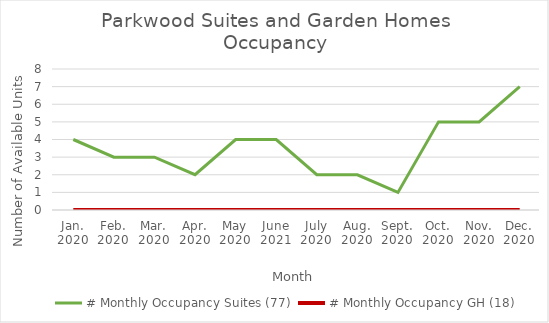
| Category | # Monthly Occupancy Suites (77) | # Monthly Occupancy GH (18) |
|---|---|---|
| Jan.
2020 | 4 | 0 |
| Feb.
2020 | 3 | 0 |
| Mar.
2020 | 3 | 0 |
| Apr.
2020 | 2 | 0 |
| May
2020 | 4 | 0 |
| June
2021 | 4 | 0 |
| July
2020 | 2 | 0 |
| Aug.
2020 | 2 | 0 |
| Sept.
2020 | 1 | 0 |
| Oct.
2020 | 5 | 0 |
| Nov.
2020 | 5 | 0 |
| Dec.
2020 | 7 | 0 |